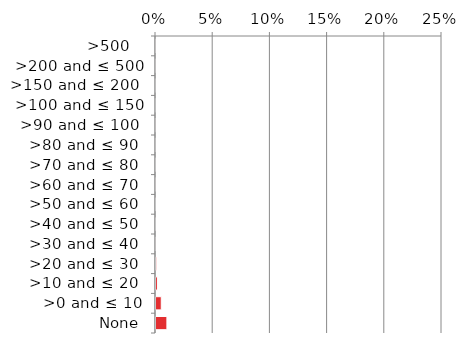
| Category | Near native & fragments |
|---|---|
|  None | 0.01 |
| >0 and ≤ 10 | 0.005 |
| >10 and ≤ 20  | 0.002 |
| >20 and ≤ 30  | 0.002 |
| >30 and ≤ 40  | 0 |
| >40 and ≤ 50  | 0.001 |
| >50 and ≤ 60  | 0.001 |
| >60 and ≤ 70  | 0 |
| >70 and ≤ 80  | 0 |
| >80 and ≤ 90  | 0 |
| >90 and ≤ 100  | 0 |
| >100 and ≤ 150 | 0 |
| >150 and ≤ 200  | 0 |
| >200 and ≤ 500 | 0 |
| >500   | 0 |